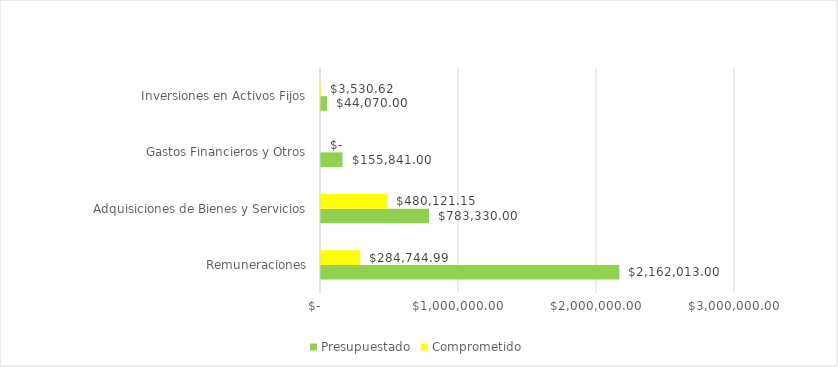
| Category |  Presupuestado  |  Comprometido  |
|---|---|---|
| Remuneraciones | 2162013 | 284744.99 |
| Adquisiciones de Bienes y Servicios | 783330 | 480121.15 |
| Gastos Financieros y Otros | 155841 | 0 |
| Inversiones en Activos Fijos | 44070 | 3530.62 |